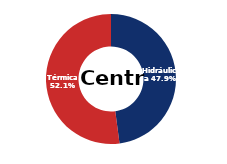
| Category | Centro |
|---|---|
| Eólica | 0 |
| Hidráulica | 1878.036 |
| Solar | 0.006 |
| Térmica | 2042.381 |